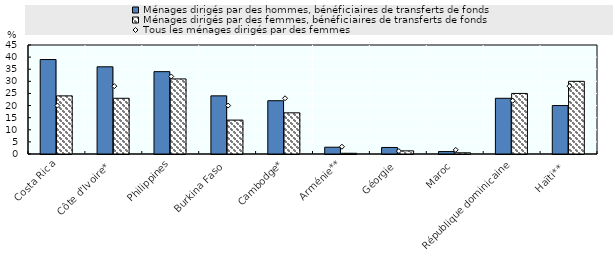
| Category | Ménages dirigés par des hommes, bénéficiaires de transferts de fonds  | Ménages dirigés par des femmes, bénéficiaires de transferts de fonds |
|---|---|---|
| Costa Rica | 39 | 24 |
| Côte d'Ivoire* | 36 | 23 |
| Philippines | 34 | 31 |
| Burkina Faso | 24 | 14 |
| Cambodge* | 22 | 17 |
| Arménie** | 2.8 | 0.3 |
| Géorgie | 2.7 | 1.3 |
| Maroc | 1 | 0.5 |
| République dominicaine | 23 | 25 |
| Haïti**  | 20 | 30 |